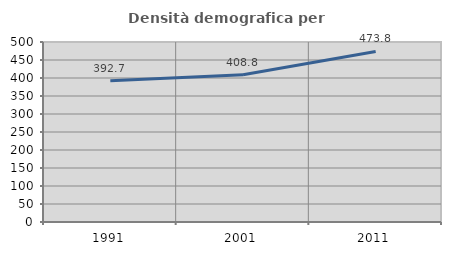
| Category | Densità demografica |
|---|---|
| 1991.0 | 392.692 |
| 2001.0 | 408.842 |
| 2011.0 | 473.818 |